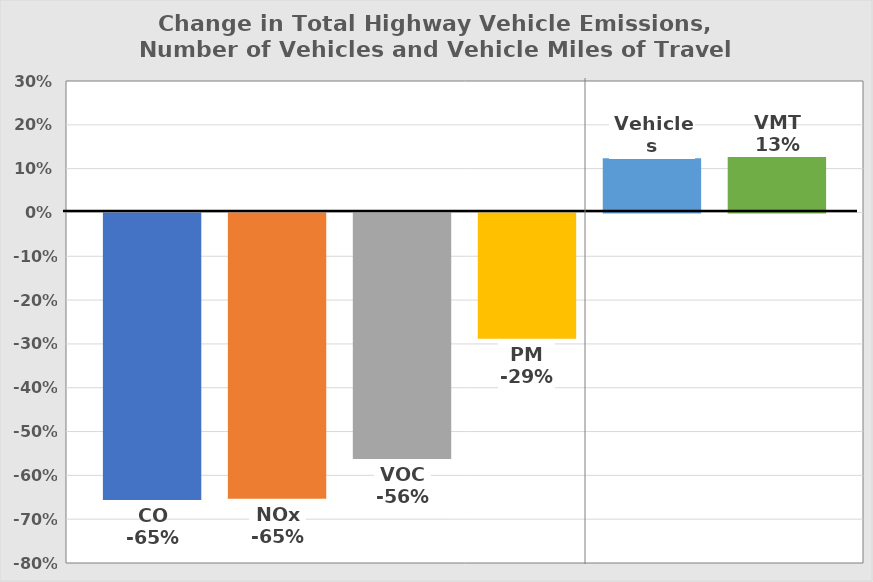
| Category | CO | NOx | VOC | PM | Vehicles | VMT |
|---|---|---|---|---|---|---|
| 0 | -0.654 | -0.651 | -0.56 | -0.286 | 0.124 | 0.127 |